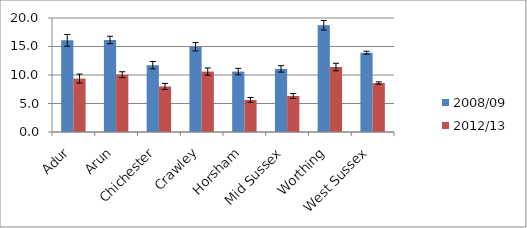
| Category | 2008/09 | 2012/13 |
|---|---|---|
| Adur | 16.076 | 9.375 |
| Arun | 16.147 | 10.053 |
| Chichester | 11.729 | 7.992 |
| Crawley | 14.965 | 10.602 |
| Horsham | 10.598 | 5.626 |
| Mid Sussex | 11.071 | 6.313 |
| Worthing | 18.724 | 11.391 |
| West Sussex | 13.915 | 8.589 |